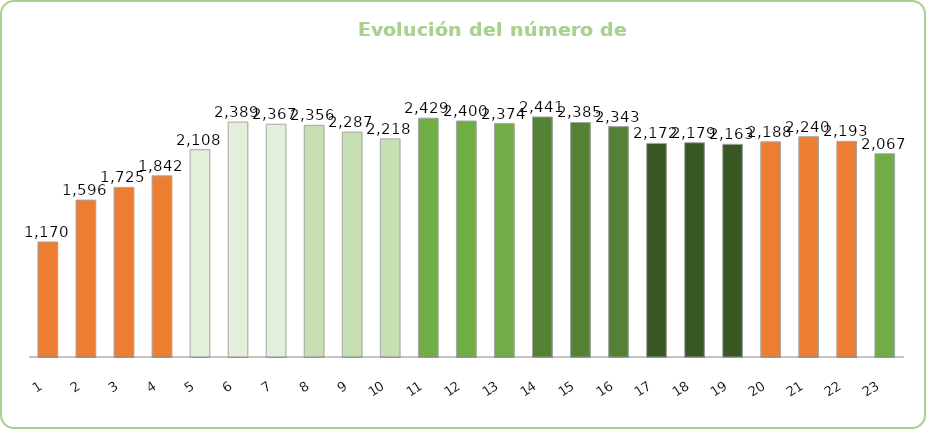
| Category | Series 0 |
|---|---|
| 0 | 1170 |
| 1 | 1596 |
| 2 | 1725 |
| 3 | 1842 |
| 4 | 2108 |
| 5 | 2389 |
| 6 | 2367 |
| 7 | 2356 |
| 8 | 2287 |
| 9 | 2218 |
| 10 | 2429 |
| 11 | 2400 |
| 12 | 2374 |
| 13 | 2441 |
| 14 | 2385 |
| 15 | 2343 |
| 16 | 2172 |
| 17 | 2179 |
| 18 | 2163 |
| 19 | 2188 |
| 20 | 2240 |
| 21 | 2193 |
| 22 | 2067 |